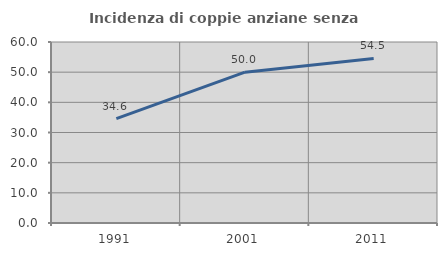
| Category | Incidenza di coppie anziane senza figli  |
|---|---|
| 1991.0 | 34.615 |
| 2001.0 | 50 |
| 2011.0 | 54.545 |